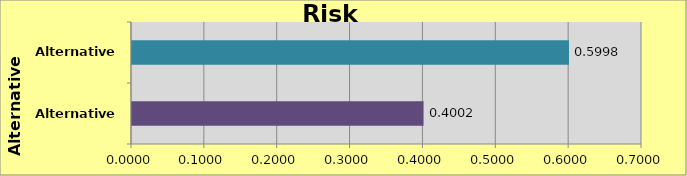
| Category | Alternative C-3 Alternative D-1 |
|---|---|
| Alternative C-3 | 0.4 |
| Alternative D-1 | 0.6 |